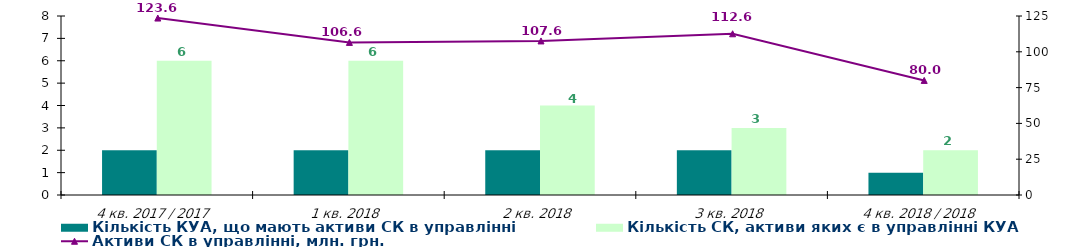
| Category | Кількість КУА, що мають активи СК в управлінні | Кількість СК, активи яких є в управлінні КУА |
|---|---|---|
| 4 кв. 2017 / 2017 | 2 | 6 |
| 1 кв. 2018 | 2 | 6 |
| 2 кв. 2018 | 2 | 4 |
| 3 кв. 2018 | 2 | 3 |
| 4 кв. 2018 / 2018 | 1 | 2 |